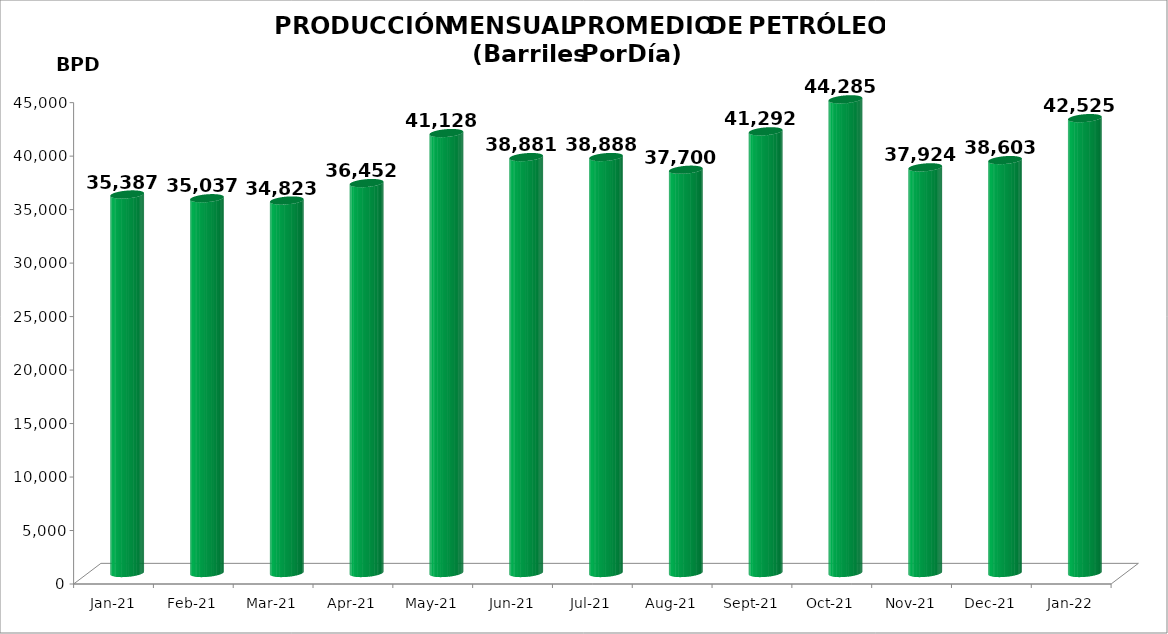
| Category | Series 0 |
|---|---|
| 2021-01-01 | 35387 |
| 2021-02-01 | 35037 |
| 2021-03-01 | 34823 |
| 2021-04-01 | 36452 |
| 2021-05-01 | 41128.032 |
| 2021-06-01 | 38881.4 |
| 2021-07-01 | 38887.645 |
| 2021-08-01 | 37699.645 |
| 2021-09-01 | 41292 |
| 2021-10-01 | 44285 |
| 2021-11-01 | 37924 |
| 2021-12-01 | 38603 |
| 2022-01-01 | 42524.516 |